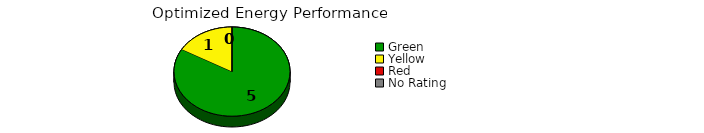
| Category | Counts |
|---|---|
| Green | 5 |
| Yellow | 1 |
| Red | 0 |
| No Rating | 0 |